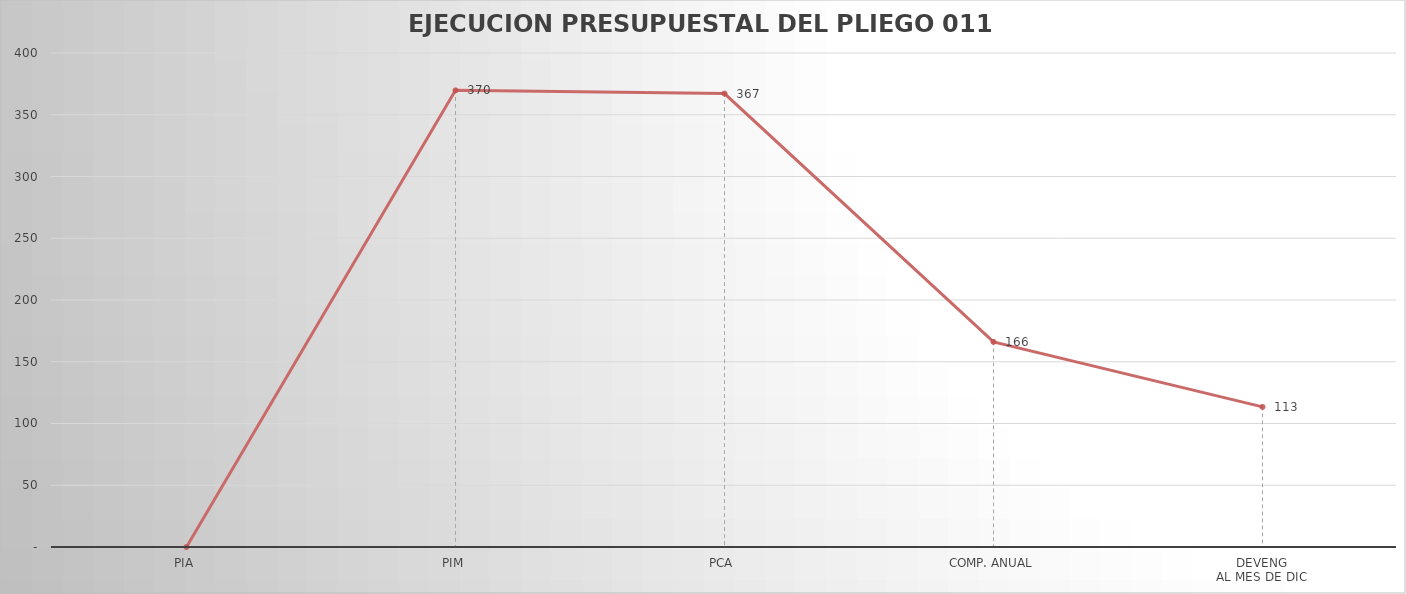
| Category | Series 0 |
|---|---|
| PIA | 0 |
| PIM | 369.758 |
| PCA | 367.14 |
| COMP. ANUAL | 166.081 |
| DEVENG
AL MES DE DIC | 113.436 |